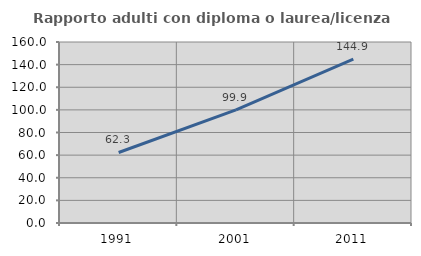
| Category | Rapporto adulti con diploma o laurea/licenza media  |
|---|---|
| 1991.0 | 62.34 |
| 2001.0 | 99.944 |
| 2011.0 | 144.85 |